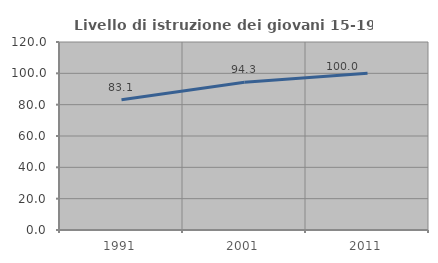
| Category | Livello di istruzione dei giovani 15-19 anni |
|---|---|
| 1991.0 | 83.099 |
| 2001.0 | 94.34 |
| 2011.0 | 100 |